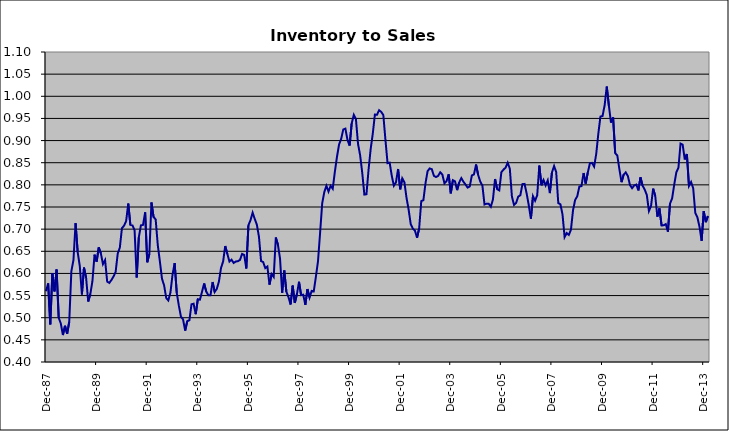
| Category | Series 0 |
|---|---|
| 1983-12-01 | 0.56 |
| 1984-01-01 | 0.578 |
| 1984-02-01 | 0.485 |
| 1984-03-01 | 0.601 |
| 1984-04-01 | 0.559 |
| 1984-05-01 | 0.609 |
| 1984-06-01 | 0.5 |
| 1984-07-01 | 0.487 |
| 1984-08-01 | 0.461 |
| 1984-09-01 | 0.482 |
| 1984-10-01 | 0.464 |
| 1984-11-01 | 0.491 |
| 1984-12-01 | 0.605 |
| 1985-01-01 | 0.63 |
| 1985-02-01 | 0.713 |
| 1985-03-01 | 0.648 |
| 1985-04-01 | 0.617 |
| 1985-05-01 | 0.553 |
| 1985-06-01 | 0.613 |
| 1985-07-01 | 0.59 |
| 1985-08-01 | 0.536 |
| 1985-09-01 | 0.553 |
| 1985-10-01 | 0.582 |
| 1985-11-01 | 0.642 |
| 1985-12-01 | 0.627 |
| 1986-01-01 | 0.659 |
| 1986-02-01 | 0.645 |
| 1986-03-01 | 0.621 |
| 1986-04-01 | 0.63 |
| 1986-05-01 | 0.582 |
| 1986-06-01 | 0.579 |
| 1986-07-01 | 0.585 |
| 1986-08-01 | 0.593 |
| 1986-09-01 | 0.603 |
| 1986-10-01 | 0.645 |
| 1986-11-01 | 0.658 |
| 1986-12-01 | 0.702 |
| 1987-01-01 | 0.708 |
| 1987-02-01 | 0.718 |
| 1987-03-01 | 0.758 |
| 1987-04-01 | 0.71 |
| 1987-05-01 | 0.708 |
| 1987-06-01 | 0.697 |
| 1987-07-01 | 0.591 |
| 1987-08-01 | 0.681 |
| 1987-09-01 | 0.709 |
| 1987-10-01 | 0.71 |
| 1987-11-01 | 0.738 |
| 1987-12-01 | 0.625 |
| 1988-01-01 | 0.644 |
| 1988-02-01 | 0.76 |
| 1988-03-01 | 0.727 |
| 1988-04-01 | 0.722 |
| 1988-05-01 | 0.664 |
| 1988-06-01 | 0.627 |
| 1988-07-01 | 0.588 |
| 1988-08-01 | 0.573 |
| 1988-09-01 | 0.545 |
| 1988-10-01 | 0.539 |
| 1988-11-01 | 0.557 |
| 1988-12-01 | 0.597 |
| 1989-01-01 | 0.623 |
| 1989-02-01 | 0.556 |
| 1989-03-01 | 0.527 |
| 1989-04-01 | 0.502 |
| 1989-05-01 | 0.496 |
| 1989-06-01 | 0.471 |
| 1989-07-01 | 0.492 |
| 1989-08-01 | 0.494 |
| 1989-09-01 | 0.53 |
| 1989-10-01 | 0.532 |
| 1989-11-01 | 0.508 |
| 1989-12-01 | 0.542 |
| 1990-01-01 | 0.541 |
| 1990-02-01 | 0.559 |
| 1990-03-01 | 0.577 |
| 1990-04-01 | 0.559 |
| 1990-05-01 | 0.551 |
| 1990-06-01 | 0.551 |
| 1990-07-01 | 0.581 |
| 1990-08-01 | 0.558 |
| 1990-09-01 | 0.565 |
| 1990-10-01 | 0.581 |
| 1990-11-01 | 0.612 |
| 1990-12-01 | 0.627 |
| 1991-01-01 | 0.662 |
| 1991-02-01 | 0.644 |
| 1991-03-01 | 0.627 |
| 1991-04-01 | 0.631 |
| 1991-05-01 | 0.624 |
| 1991-06-01 | 0.627 |
| 1991-07-01 | 0.628 |
| 1991-08-01 | 0.631 |
| 1991-09-01 | 0.644 |
| 1991-10-01 | 0.642 |
| 1991-11-01 | 0.611 |
| 1991-12-01 | 0.709 |
| 1992-01-01 | 0.72 |
| 1992-02-01 | 0.737 |
| 1992-03-01 | 0.723 |
| 1992-04-01 | 0.71 |
| 1992-05-01 | 0.683 |
| 1992-06-01 | 0.628 |
| 1992-07-01 | 0.626 |
| 1992-08-01 | 0.612 |
| 1992-09-01 | 0.616 |
| 1992-10-01 | 0.575 |
| 1992-11-01 | 0.599 |
| 1992-12-01 | 0.592 |
| 1993-01-01 | 0.681 |
| 1993-02-01 | 0.665 |
| 1993-03-01 | 0.633 |
| 1993-04-01 | 0.556 |
| 1993-05-01 | 0.607 |
| 1993-06-01 | 0.559 |
| 1993-07-01 | 0.547 |
| 1993-08-01 | 0.53 |
| 1993-09-01 | 0.573 |
| 1993-10-01 | 0.533 |
| 1993-11-01 | 0.553 |
| 1993-12-01 | 0.581 |
| 1994-01-01 | 0.551 |
| 1994-02-01 | 0.552 |
| 1994-03-01 | 0.529 |
| 1994-04-01 | 0.565 |
| 1994-05-01 | 0.545 |
| 1994-06-01 | 0.561 |
| 1994-07-01 | 0.56 |
| 1994-08-01 | 0.592 |
| 1994-09-01 | 0.627 |
| 1994-10-01 | 0.691 |
| 1994-11-01 | 0.758 |
| 1994-12-01 | 0.784 |
| 1995-01-01 | 0.798 |
| 1995-02-01 | 0.785 |
| 1995-03-01 | 0.798 |
| 1995-04-01 | 0.791 |
| 1995-05-01 | 0.829 |
| 1995-06-01 | 0.863 |
| 1995-07-01 | 0.891 |
| 1995-08-01 | 0.904 |
| 1995-09-01 | 0.925 |
| 1995-10-01 | 0.927 |
| 1995-11-01 | 0.901 |
| 1995-12-01 | 0.889 |
| 1996-01-01 | 0.939 |
| 1996-02-01 | 0.958 |
| 1996-03-01 | 0.949 |
| 1996-04-01 | 0.892 |
| 1996-05-01 | 0.867 |
| 1996-06-01 | 0.827 |
| 1996-07-01 | 0.778 |
| 1996-08-01 | 0.779 |
| 1996-09-01 | 0.834 |
| 1996-10-01 | 0.881 |
| 1996-11-01 | 0.916 |
| 1996-12-01 | 0.959 |
| 1997-01-01 | 0.958 |
| 1997-02-01 | 0.969 |
| 1997-03-01 | 0.965 |
| 1997-04-01 | 0.958 |
| 1997-05-01 | 0.902 |
| 1997-06-01 | 0.849 |
| 1997-07-01 | 0.85 |
| 1997-08-01 | 0.821 |
| 1997-09-01 | 0.798 |
| 1997-10-01 | 0.806 |
| 1997-11-01 | 0.836 |
| 1997-12-01 | 0.79 |
| 1998-01-01 | 0.815 |
| 1998-02-01 | 0.806 |
| 1998-03-01 | 0.771 |
| 1998-04-01 | 0.744 |
| 1998-05-01 | 0.711 |
| 1998-06-01 | 0.701 |
| 1998-07-01 | 0.697 |
| 1998-08-01 | 0.681 |
| 1998-09-01 | 0.702 |
| 1998-10-01 | 0.763 |
| 1998-11-01 | 0.765 |
| 1998-12-01 | 0.803 |
| 1999-01-01 | 0.831 |
| 1999-02-01 | 0.837 |
| 1999-03-01 | 0.835 |
| 1999-04-01 | 0.82 |
| 1999-05-01 | 0.818 |
| 1999-06-01 | 0.82 |
| 1999-07-01 | 0.828 |
| 1999-08-01 | 0.823 |
| 1999-09-01 | 0.803 |
| 1999-10-01 | 0.809 |
| 1999-11-01 | 0.824 |
| 1999-12-01 | 0.781 |
| 2000-01-01 | 0.81 |
| 2000-02-01 | 0.808 |
| 2000-03-01 | 0.788 |
| 2000-04-01 | 0.805 |
| 2000-05-01 | 0.815 |
| 2000-06-01 | 0.807 |
| 2000-07-01 | 0.801 |
| 2000-08-01 | 0.794 |
| 2000-09-01 | 0.796 |
| 2000-10-01 | 0.821 |
| 2000-11-01 | 0.824 |
| 2000-12-01 | 0.846 |
| 2001-01-01 | 0.822 |
| 2001-02-01 | 0.807 |
| 2001-03-01 | 0.798 |
| 2001-04-01 | 0.756 |
| 2001-05-01 | 0.757 |
| 2001-06-01 | 0.757 |
| 2001-07-01 | 0.751 |
| 2001-08-01 | 0.767 |
| 2001-09-01 | 0.813 |
| 2001-10-01 | 0.79 |
| 2001-11-01 | 0.788 |
| 2001-12-01 | 0.829 |
| 2002-01-01 | 0.834 |
| 2002-02-01 | 0.839 |
| 2002-03-01 | 0.85 |
| 2002-04-01 | 0.837 |
| 2002-05-01 | 0.774 |
| 2002-06-01 | 0.755 |
| 2002-07-01 | 0.759 |
| 2002-08-01 | 0.773 |
| 2002-09-01 | 0.777 |
| 2002-10-01 | 0.802 |
| 2002-11-01 | 0.802 |
| 2002-12-01 | 0.78 |
| 2003-01-01 | 0.754 |
| 2003-02-01 | 0.723 |
| 2003-03-01 | 0.774 |
| 2003-04-01 | 0.764 |
| 2003-05-01 | 0.777 |
| 2003-06-01 | 0.844 |
| 2003-07-01 | 0.799 |
| 2003-08-01 | 0.811 |
| 2003-09-01 | 0.799 |
| 2003-10-01 | 0.81 |
| 2003-11-01 | 0.781 |
| 2003-12-01 | 0.828 |
| 2004-01-01 | 0.843 |
| 2004-02-01 | 0.829 |
| 2004-03-01 | 0.759 |
| 2004-04-01 | 0.756 |
| 2004-05-01 | 0.733 |
| 2004-06-01 | 0.682 |
| 2004-07-01 | 0.691 |
| 2004-08-01 | 0.687 |
| 2004-09-01 | 0.699 |
| 2004-10-01 | 0.743 |
| 2004-11-01 | 0.766 |
| 2004-12-01 | 0.774 |
| 2005-01-01 | 0.796 |
| 2005-02-01 | 0.797 |
| 2005-03-01 | 0.827 |
| 2005-04-01 | 0.803 |
| 2005-05-01 | 0.828 |
| 2005-06-01 | 0.849 |
| 2005-07-01 | 0.85 |
| 2005-08-01 | 0.841 |
| 2005-09-01 | 0.87 |
| 2005-10-01 | 0.916 |
| 2005-11-01 | 0.954 |
| 2005-12-01 | 0.955 |
| 2006-01-01 | 0.98 |
| 2006-02-01 | 1.022 |
| 2006-03-01 | 0.979 |
| 2006-04-01 | 0.941 |
| 2006-05-01 | 0.952 |
| 2006-06-01 | 0.872 |
| 2006-07-01 | 0.866 |
| 2006-08-01 | 0.835 |
| 2006-09-01 | 0.806 |
| 2006-10-01 | 0.823 |
| 2006-11-01 | 0.828 |
| 2006-12-01 | 0.82 |
| 2007-01-01 | 0.8 |
| 2007-02-01 | 0.792 |
| 2007-03-01 | 0.798 |
| 2007-04-01 | 0.801 |
| 2007-05-01 | 0.787 |
| 2007-06-01 | 0.817 |
| 2007-07-01 | 0.798 |
| 2007-08-01 | 0.789 |
| 2007-09-01 | 0.777 |
| 2007-10-01 | 0.741 |
| 2007-11-01 | 0.752 |
| 2007-12-01 | 0.791 |
| 2008-01-01 | 0.775 |
| 2008-02-01 | 0.728 |
| 2008-03-01 | 0.747 |
| 2008-04-01 | 0.708 |
| 2008-05-01 | 0.709 |
| 2008-06-01 | 0.711 |
| 2008-07-01 | 0.694 |
| 2008-08-01 | 0.758 |
| 2008-09-01 | 0.769 |
| 2008-10-01 | 0.8 |
| 2008-11-01 | 0.828 |
| 2008-12-01 | 0.839 |
| 2009-01-01 | 0.893 |
| 2009-02-01 | 0.891 |
| 2009-03-01 | 0.857 |
| 2009-04-01 | 0.87 |
| 2009-05-01 | 0.797 |
| 2009-06-01 | 0.806 |
| 2009-07-01 | 0.793 |
| 2009-08-01 | 0.736 |
| 2009-09-01 | 0.726 |
| 2009-10-01 | 0.705 |
| 2009-11-01 | 0.674 |
| 2009-12-01 | 0.741 |
| 2010-01-01 | 0.716 |
| 2010-02-01 | 0.73 |